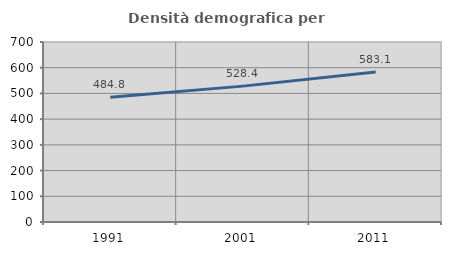
| Category | Densità demografica |
|---|---|
| 1991.0 | 484.757 |
| 2001.0 | 528.388 |
| 2011.0 | 583.069 |